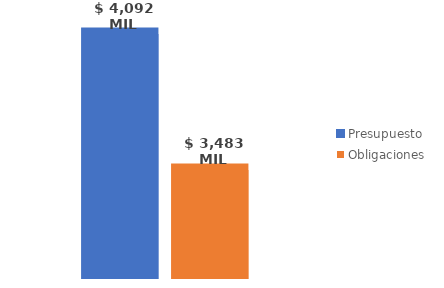
| Category | Presupuesto | Obligaciones |
|---|---|---|
| Total | 4092221978745.827 | 3483367076215.608 |